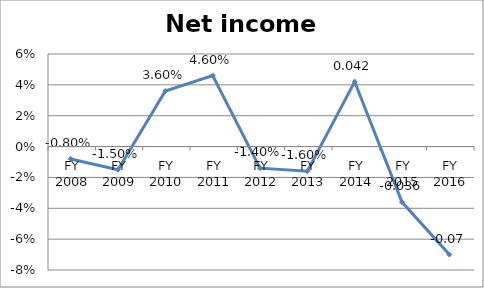
| Category | Net income ratio |
|---|---|
| FY 2016 | -0.07 |
| FY 2015 | -0.036 |
| FY 2014 | 0.042 |
| FY 2013 | -0.016 |
| FY 2012 | -0.014 |
| FY 2011 | 0.046 |
| FY 2010 | 0.036 |
| FY 2009 | -0.015 |
| FY 2008 | -0.008 |